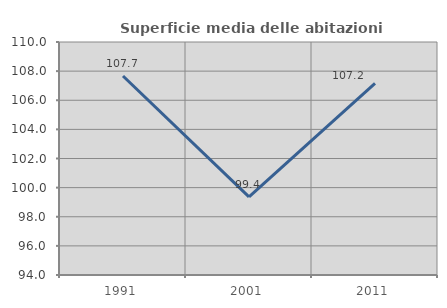
| Category | Superficie media delle abitazioni occupate |
|---|---|
| 1991.0 | 107.664 |
| 2001.0 | 99.364 |
| 2011.0 | 107.151 |